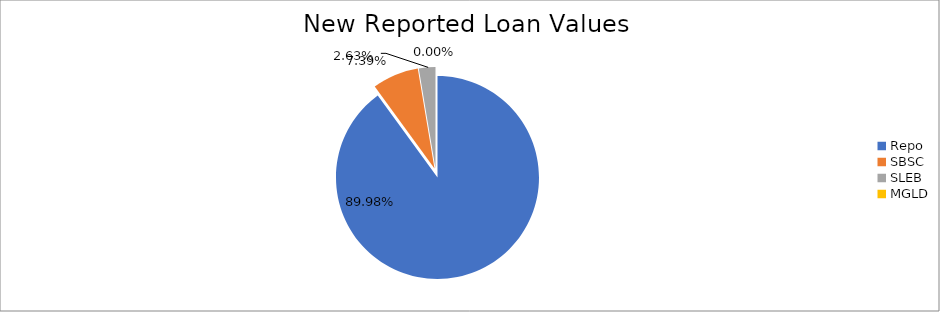
| Category | Series 0 |
|---|---|
| Repo | 12424464.063 |
| SBSC | 1019950.179 |
| SLEB | 363657.206 |
| MGLD | 82.231 |